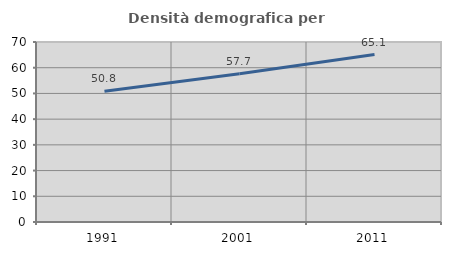
| Category | Densità demografica |
|---|---|
| 1991.0 | 50.822 |
| 2001.0 | 57.661 |
| 2011.0 | 65.121 |